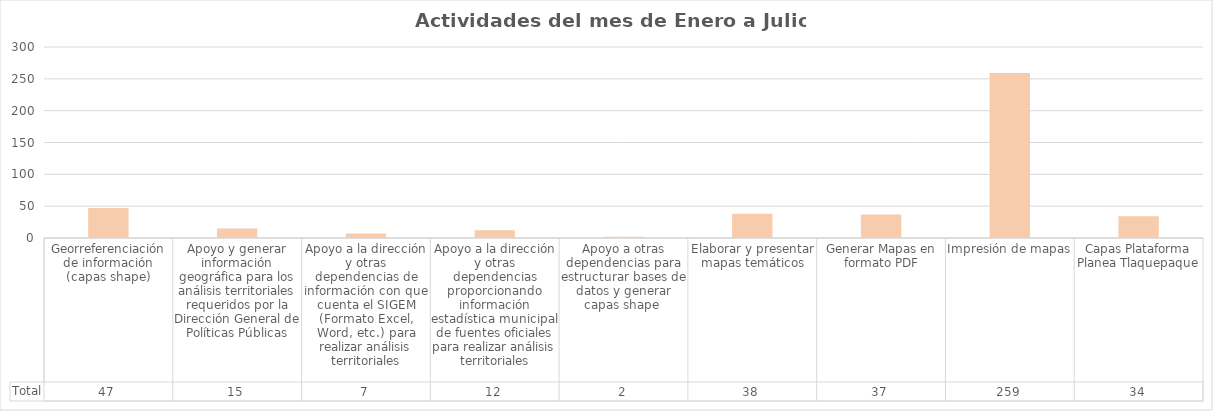
| Category | Total |
|---|---|
| Georreferenciación de información (capas shape) | 47 |
| Apoyo y generar información geográfica para los análisis territoriales requeridos por la Dirección General de Políticas Públicas | 15 |
| Apoyo a la dirección y otras dependencias de información con que cuenta el SIGEM (Formato Excel, Word, etc.) para realizar análisis territoriales | 7 |
| Apoyo a la dirección y otras dependencias proporcionando información estadística municipal de fuentes oficiales para realizar análisis territoriales | 12 |
| Apoyo a otras dependencias para estructurar bases de datos y generar capas shape  | 2 |
| Elaborar y presentar mapas temáticos | 38 |
| Generar Mapas en formato PDF | 37 |
| Impresión de mapas | 259 |
| Capas Plataforma Planea Tlaquepaque | 34 |